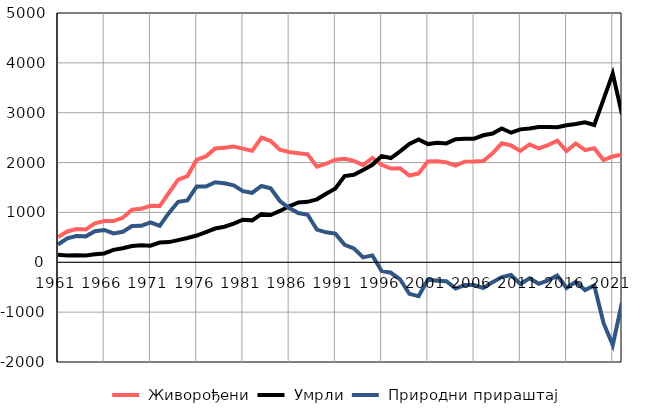
| Category |  Живорођени |  Умрли |  Природни прираштај |
|---|---|---|---|
| 1961.0 | 504 | 149 | 355 |
| 1962.0 | 618 | 136 | 482 |
| 1963.0 | 666 | 139 | 527 |
| 1964.0 | 657 | 137 | 520 |
| 1965.0 | 782 | 159 | 623 |
| 1966.0 | 826 | 177 | 649 |
| 1967.0 | 827 | 249 | 578 |
| 1968.0 | 893 | 282 | 611 |
| 1969.0 | 1054 | 325 | 729 |
| 1970.0 | 1072 | 340 | 732 |
| 1971.0 | 1132 | 333 | 799 |
| 1972.0 | 1128 | 397 | 731 |
| 1973.0 | 1395 | 405 | 990 |
| 1974.0 | 1659 | 445 | 1214 |
| 1975.0 | 1729 | 488 | 1241 |
| 1976.0 | 2058 | 537 | 1521 |
| 1977.0 | 2124 | 604 | 1520 |
| 1978.0 | 2282 | 677 | 1605 |
| 1979.0 | 2299 | 713 | 1586 |
| 1980.0 | 2320 | 775 | 1545 |
| 1981.0 | 2280 | 853 | 1427 |
| 1982.0 | 2235 | 841 | 1394 |
| 1983.0 | 2498 | 968 | 1530 |
| 1984.0 | 2431 | 948 | 1483 |
| 1985.0 | 2259 | 1030 | 1229 |
| 1986.0 | 2211 | 1123 | 1088 |
| 1987.0 | 2187 | 1200 | 987 |
| 1988.0 | 2165 | 1212 | 953 |
| 1989.0 | 1918 | 1263 | 655 |
| 1990.0 | 1977 | 1376 | 601 |
| 1991.0 | 2057 | 1482 | 575 |
| 1992.0 | 2077 | 1728 | 349 |
| 1993.0 | 2033 | 1754 | 279 |
| 1994.0 | 1951 | 1853 | 98 |
| 1995.0 | 2093 | 1955 | 138 |
| 1996.0 | 1955 | 2130 | -175 |
| 1997.0 | 1881 | 2091 | -210 |
| 1998.0 | 1884 | 2225 | -341 |
| 1999.0 | 1740 | 2373 | -633 |
| 2000.0 | 1781 | 2462 | -681 |
| 2001.0 | 2021 | 2371 | -350 |
| 2002.0 | 2027 | 2397 | -370 |
| 2003.0 | 2004 | 2385 | -381 |
| 2004.0 | 1941 | 2468 | -527 |
| 2005.0 | 2019 | 2477 | -458 |
| 2006.0 | 2020 | 2478 | -458 |
| 2007.0 | 2032 | 2547 | -515 |
| 2008.0 | 2184 | 2582 | -398 |
| 2009.0 | 2387 | 2684 | -297 |
| 2010.0 | 2344 | 2599 | -255 |
| 2011.0 | 2233 | 2666 | -433 |
| 2012.0 | 2363 | 2683 | -320 |
| 2013.0 | 2284 | 2715 | -431 |
| 2014.0 | 2351 | 2713 | -362 |
| 2015.0 | 2440 | 2707 | -267 |
| 2016.0 | 2233 | 2748 | -515 |
| 2017.0 | 2384 | 2774 | -390 |
| 2018.0 | 2248 | 2806 | -558 |
| 2019.0 | 2288 | 2754 | -466 |
| 2020.0 | 2051 | 3267 | -1216 |
| 2021.0 | 2123 | 3784 | -1661 |
| 2022.0 | 2162 | 2967 | -805 |